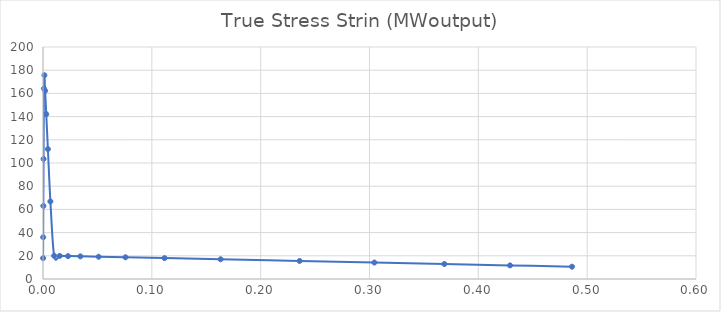
| Category | Series 0 |
|---|---|
| 8.99959502429071e-05 | 17.998 |
| 0.000179983801943807 | 35.996 |
| 0.000314950397916229 | 62.988 |
| 0.000517366143053604 | 103.471 |
| 0.000820912958736214 | 164.18 |
| 0.00127606548202025 | 175.66 |
| 0.00195839109970242 | 162.239 |
| 0.00298102233448872 | 142.124 |
| 0.00451300107383731 | 111.984 |
| 0.00680658256963524 | 66.849 |
| 0.0102371214079935 | 19.979 |
| 0.0153610132102306 | 19.88 |
| 0.0229978113721286 | 19.733 |
| 0.0343449033807882 | 19.514 |
| 0.0511277156801529 | 19.189 |
| 0.0757852575808854 | 18.71 |
| 0.111667484848671 | 18.01 |
| 0.163187156184584 | 16.997 |
| 0.235807819867008 | 15.556 |
| 0.304488303267768 | 14.196 |
| 0.368753404755717 | 12.926 |
| 0.429136711841463 | 11.734 |
| 0.486080574800857 | 10.612 |